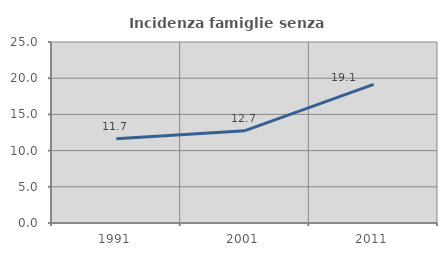
| Category | Incidenza famiglie senza nuclei |
|---|---|
| 1991.0 | 11.652 |
| 2001.0 | 12.749 |
| 2011.0 | 19.139 |